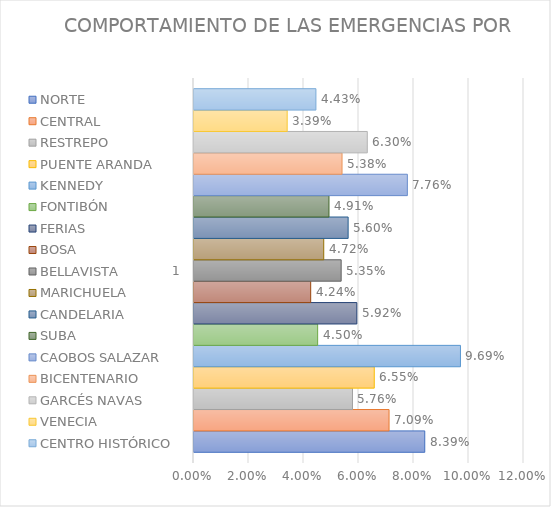
| Category | NORTE | CENTRAL | RESTREPO | PUENTE ARANDA | KENNEDY | FONTIBÓN | FERIAS | BOSA | BELLAVISTA | MARICHUELA | CANDELARIA | SUBA | CAOBOS SALAZAR | BICENTENARIO | GARCÉS NAVAS | VENECIA | CENTRO HISTÓRICO |
|---|---|---|---|---|---|---|---|---|---|---|---|---|---|---|---|---|---|
| 0 | 0.084 | 0.071 | 0.058 | 0.066 | 0.097 | 0.045 | 0.059 | 0.042 | 0.054 | 0.047 | 0.056 | 0.049 | 0.078 | 0.054 | 0.063 | 0.034 | 0.044 |